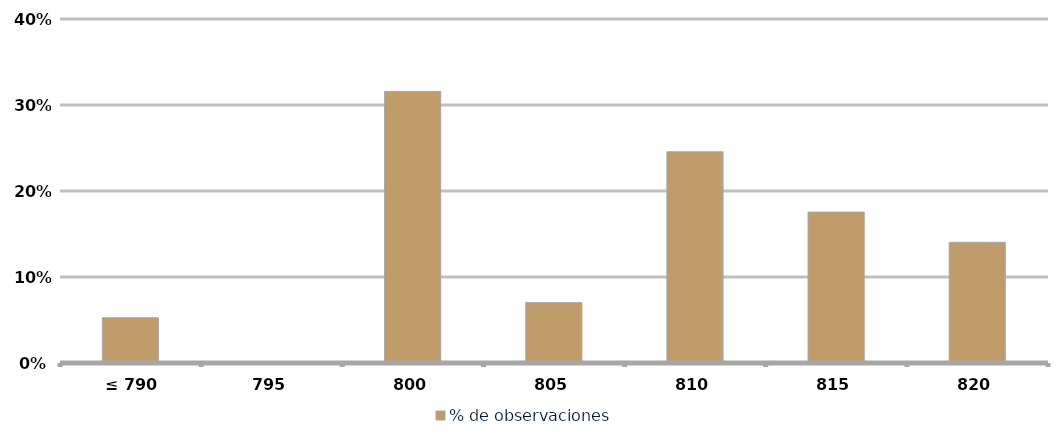
| Category | % de observaciones  |
|---|---|
|  ≤ 790  | 0.053 |
|  795  | 0 |
|  800  | 0.316 |
|  805  | 0.07 |
|  810  | 0.246 |
| 815 | 0.175 |
|  820  | 0.14 |